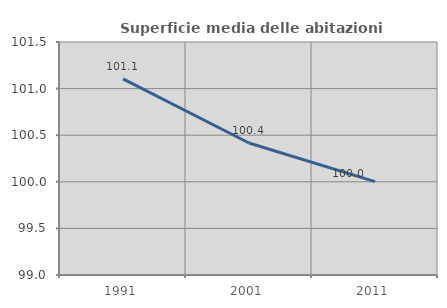
| Category | Superficie media delle abitazioni occupate |
|---|---|
| 1991.0 | 101.105 |
| 2001.0 | 100.417 |
| 2011.0 | 100.002 |